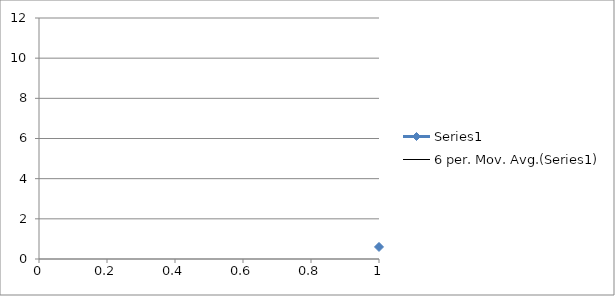
| Category | Series 0 |
|---|---|
| 0 | 0.6 |
| 1 | 4.6 |
| 2 | 6.5 |
| 3 | 7.7 |
| 4 | 6.8 |
| 5 | 3.5 |
| 6 | 6.7 |
| 7 | 6.9 |
| 8 | 6.7 |
| 9 | 3.6 |
| 10 | 8.7 |
| 11 | 2 |
| 12 | 6.8 |
| 13 | 9.8 |
| 14 | 0.8 |